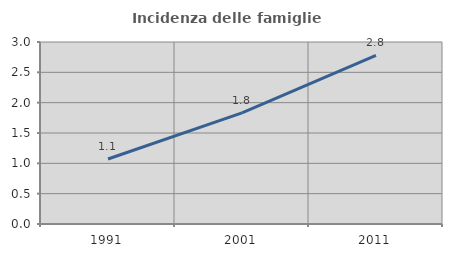
| Category | Incidenza delle famiglie numerose |
|---|---|
| 1991.0 | 1.071 |
| 2001.0 | 1.831 |
| 2011.0 | 2.778 |